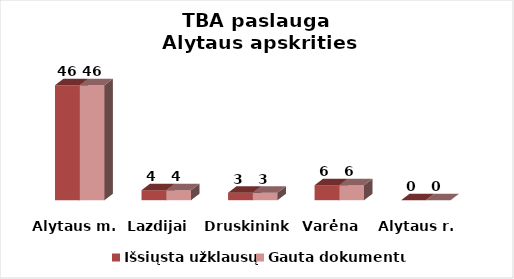
| Category | Išsiųsta užklausų | Gauta dokumentų |
|---|---|---|
| Alytaus m. | 46 | 46 |
| Lazdijai | 4 | 4 |
| Druskininkai | 3 | 3 |
| Varėna | 6 | 6 |
| Alytaus r. | 0 | 0 |